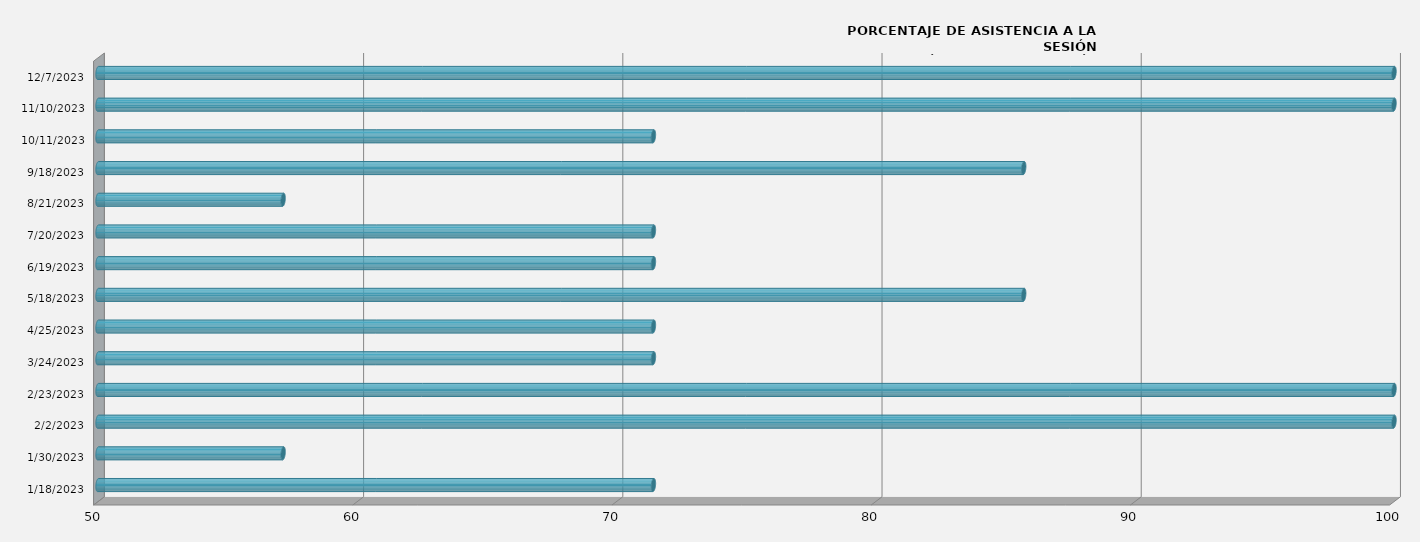
| Category | Series 0 |
|---|---|
| 1/18/23 | 71.429 |
| 1/30/23 | 57.143 |
| 2/2/23 | 100 |
| 2/23/23 | 100 |
| 3/24/23 | 71.429 |
| 4/25/23 | 71.429 |
| 5/18/23 | 85.714 |
| 6/19/23 | 71.429 |
| 7/20/23 | 71.429 |
| 8/21/23 | 57.143 |
| 9/18/23 | 85.714 |
| 10/11/23 | 71.429 |
| 11/10/23 | 100 |
| 12/7/23 | 100 |